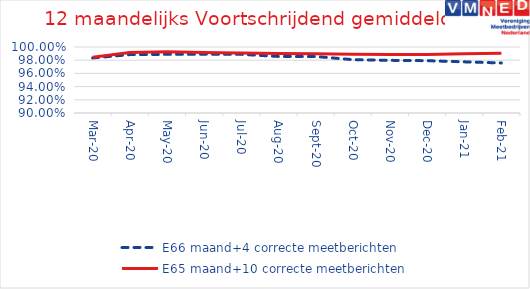
| Category | E66 maand+4 correcte meetberichten | E65 maand+10 correcte meetberichten |
|---|---|---|
| 2020-03-01 | 0.983 | 0.984 |
| 2020-04-01 | 0.988 | 0.992 |
| 2020-05-01 | 0.989 | 0.993 |
| 2020-06-01 | 0.989 | 0.992 |
| 2020-07-01 | 0.989 | 0.991 |
| 2020-08-01 | 0.986 | 0.99 |
| 2020-09-01 | 0.986 | 0.99 |
| 2020-10-01 | 0.981 | 0.989 |
| 2020-11-01 | 0.98 | 0.989 |
| 2020-12-01 | 0.979 | 0.989 |
| 2021-01-01 | 0.978 | 0.99 |
| 2021-02-01 | 0.976 | 0.991 |